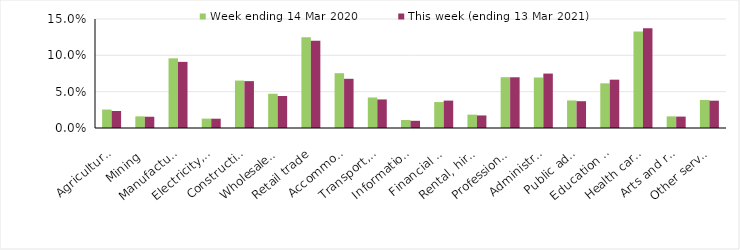
| Category | Week ending 14 Mar 2020 | This week (ending 13 Mar 2021) |
|---|---|---|
| Agriculture, forestry and fishing | 0.025 | 0.023 |
| Mining | 0.016 | 0.016 |
| Manufacturing | 0.096 | 0.091 |
| Electricity, gas, water and waste services | 0.013 | 0.013 |
| Construction | 0.065 | 0.064 |
| Wholesale trade | 0.047 | 0.044 |
| Retail trade | 0.125 | 0.12 |
| Accommodation and food services | 0.075 | 0.068 |
| Transport, postal and warehousing | 0.042 | 0.039 |
| Information media and telecommunications | 0.011 | 0.01 |
| Financial and insurance services | 0.036 | 0.038 |
| Rental, hiring and real estate services | 0.018 | 0.017 |
| Professional, scientific and technical services | 0.07 | 0.07 |
| Administrative and support services | 0.07 | 0.075 |
| Public administration and safety | 0.038 | 0.037 |
| Education and training | 0.062 | 0.066 |
| Health care and social assistance | 0.133 | 0.137 |
| Arts and recreation services | 0.016 | 0.016 |
| Other services | 0.038 | 0.038 |